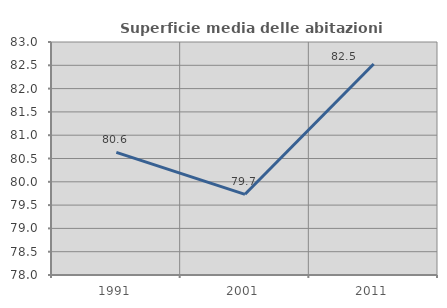
| Category | Superficie media delle abitazioni occupate |
|---|---|
| 1991.0 | 80.631 |
| 2001.0 | 79.732 |
| 2011.0 | 82.526 |